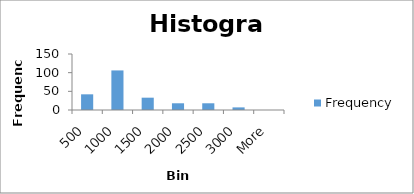
| Category | Frequency |
|---|---|
| 500 | 42 |
| 1000 | 106 |
| 1500 | 33 |
| 2000 | 18 |
| 2500 | 18 |
| 3000 | 7 |
| More | 0 |